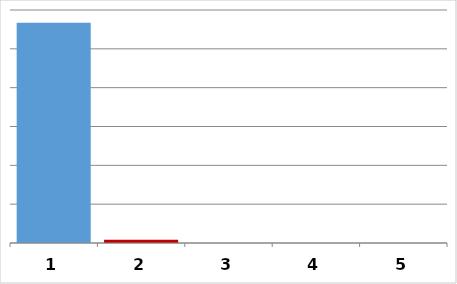
| Category | Series 0 |
|---|---|
| 0 | 5669866.27 |
| 1 | 81808.96 |
| 2 | 0 |
| 3 | 0 |
| 4 | 0 |